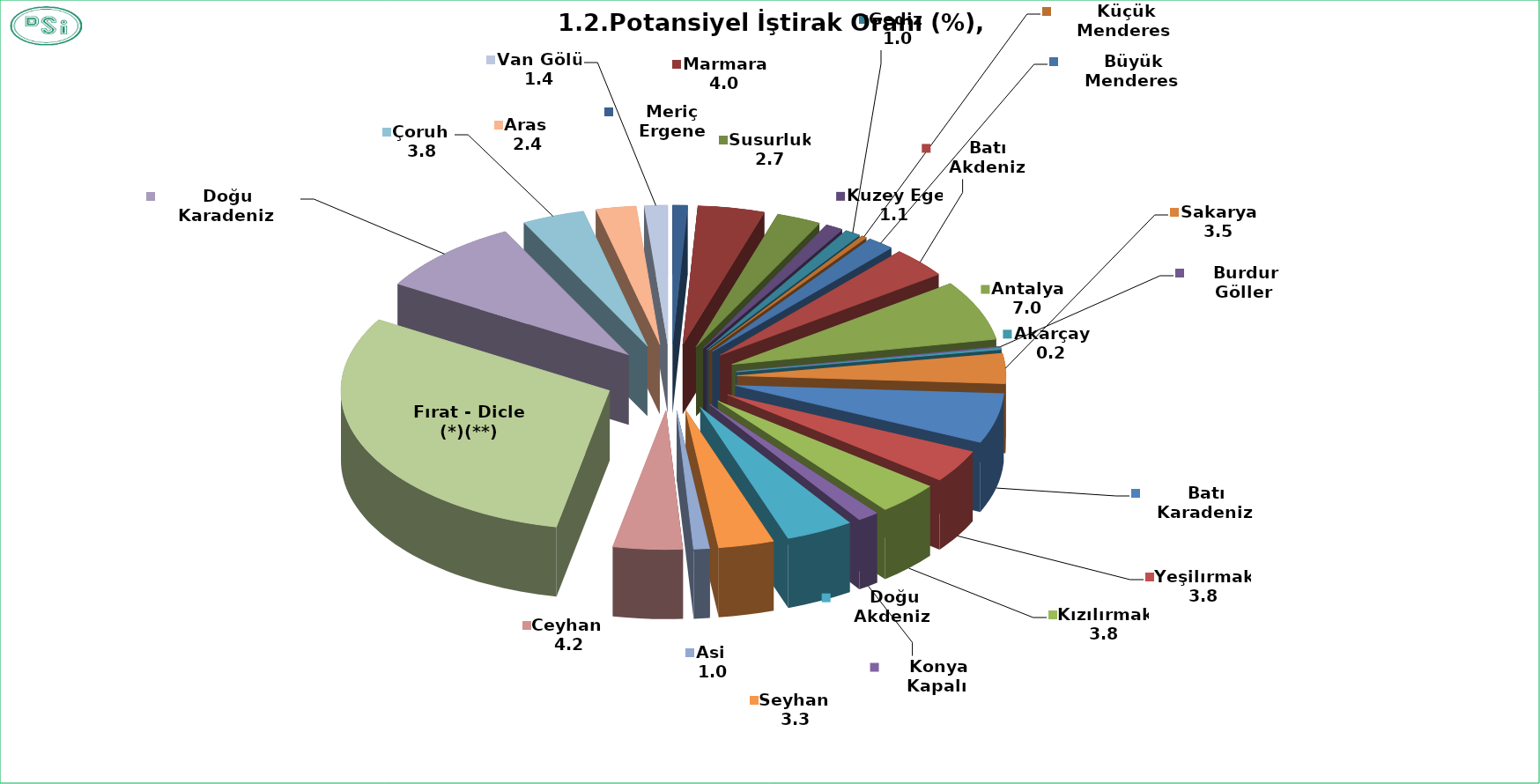
| Category | Potansiyel İştirak Oranı (%) |
|---|---|
| Meriç Ergene | 0.894 |
| Marmara  | 4.015 |
| Susurluk  | 2.677 |
| Kuzey Ege  | 1.071 |
| Gediz  | 0.958 |
| Küçük Menderes  | 0.337 |
| Büyük Menderes  | 1.644 |
| Batı Akdeniz  | 3.506 |
| Antalya  | 6.983 |
| Burdur Göller  | 0.126 |
| Akarçay  | 0.202 |
| Sakarya  | 3.5 |
| Batı Karadeniz  | 5.825 |
| Yeşilırmak  | 3.801 |
| Kızılırmak  | 3.778 |
| Konya Kapalı  | 1.299 |
| Doğu Akdeniz  | 4.078 |
| Seyhan  | 3.345 |
| Asi  | 0.961 |
| Ceyhan  | 4.172 |
| Fırat - Dicle (*)(**) | 30.381 |
| Doğu Karadeniz  | 8.861 |
| Çoruh  | 3.766 |
| Aras  | 2.417 |
| Van Gölü  | 1.404 |